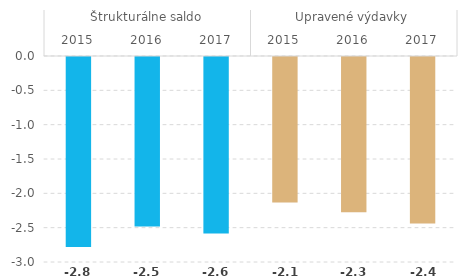
| Category | Výdavky VS na vlastné investície (% HDP) |
|---|---|
| 0 | -2.767 |
| 1 | -2.469 |
| 2 | -2.569 |
| 3 | -2.12 |
| 4 | -2.26 |
| 5 | -2.423 |